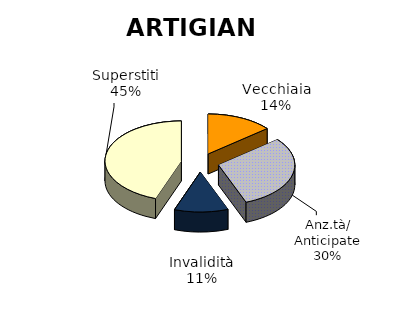
| Category | Series 0 |
|---|---|
| Vecchiaia | 5427 |
| Anz.tà/ Anticipate | 11630 |
| Invalidità | 4401 |
| Superstiti | 17209 |